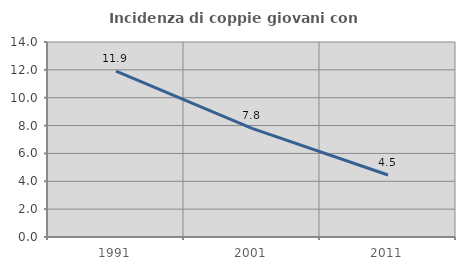
| Category | Incidenza di coppie giovani con figli |
|---|---|
| 1991.0 | 11.903 |
| 2001.0 | 7.795 |
| 2011.0 | 4.454 |